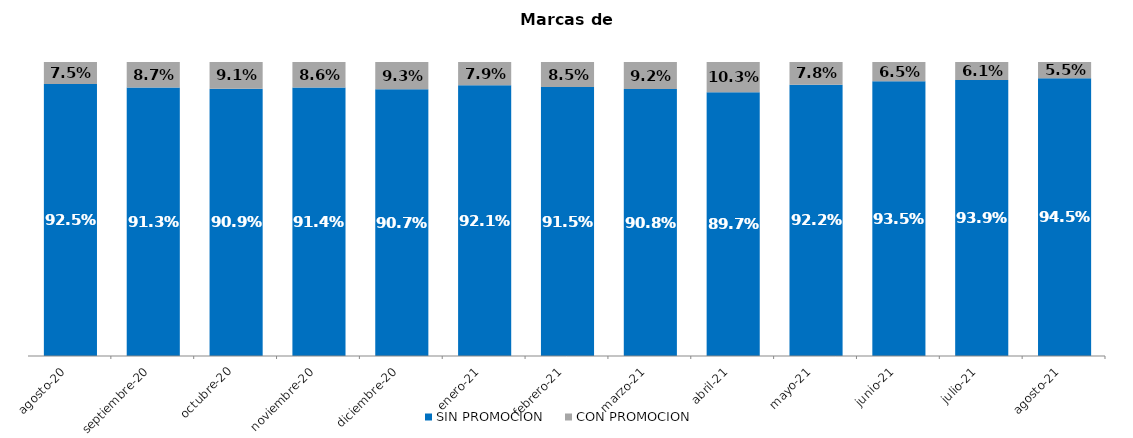
| Category | SIN PROMOCION   | CON PROMOCION   |
|---|---|---|
| 2020-08-01 | 0.925 | 0.075 |
| 2020-09-01 | 0.913 | 0.087 |
| 2020-10-01 | 0.909 | 0.091 |
| 2020-11-01 | 0.914 | 0.086 |
| 2020-12-01 | 0.907 | 0.093 |
| 2021-01-01 | 0.921 | 0.079 |
| 2021-02-01 | 0.915 | 0.085 |
| 2021-03-01 | 0.908 | 0.092 |
| 2021-04-01 | 0.897 | 0.103 |
| 2021-05-01 | 0.922 | 0.078 |
| 2021-06-01 | 0.935 | 0.065 |
| 2021-07-01 | 0.939 | 0.061 |
| 2021-08-01 | 0.945 | 0.055 |